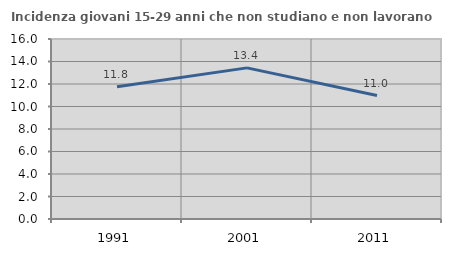
| Category | Incidenza giovani 15-29 anni che non studiano e non lavorano  |
|---|---|
| 1991.0 | 11.765 |
| 2001.0 | 13.433 |
| 2011.0 | 10.976 |